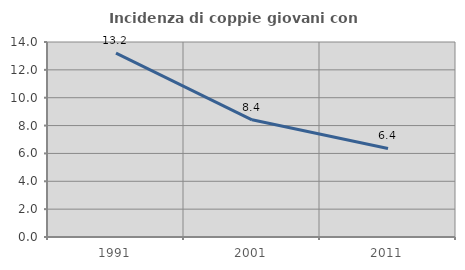
| Category | Incidenza di coppie giovani con figli |
|---|---|
| 1991.0 | 13.196 |
| 2001.0 | 8.415 |
| 2011.0 | 6.358 |